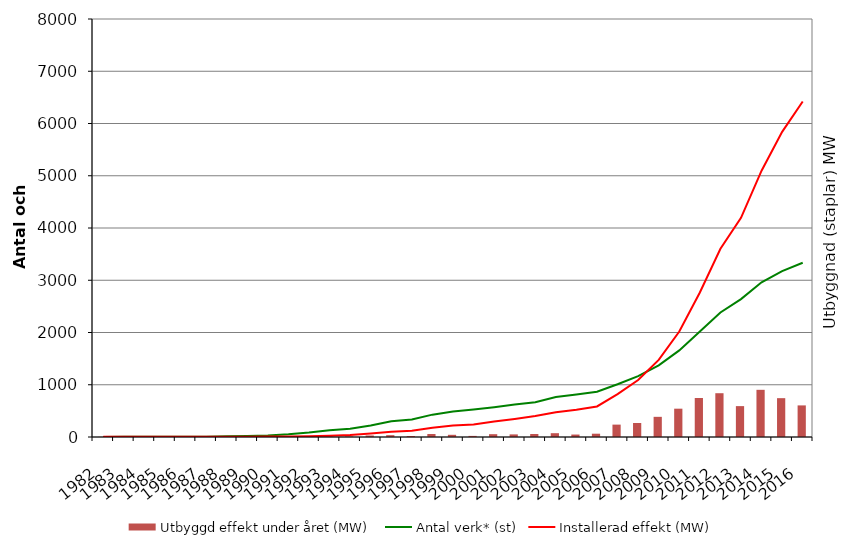
| Category | Utbyggd effekt under året (MW) |
|---|---|
| 1982.0 | 3 |
| 1983.0 | 2 |
| 1984.0 | 0 |
| 1985.0 | 0 |
| 1986.0 | 0 |
| 1987.0 | 0 |
| 1988.0 | 1 |
| 1989.0 | 0 |
| 1990.0 | 2 |
| 1991.0 | 1 |
| 1992.0 | 7 |
| 1993.0 | 10 |
| 1994.0 | 12 |
| 1995.0 | 29 |
| 1996.0 | 35 |
| 1997.0 | 19 |
| 1998.0 | 57 |
| 1999.0 | 42 |
| 2000.0 | 21 |
| 2001.0 | 54 |
| 2002.0 | 50 |
| 2003.0 | 57 |
| 2004.0 | 73 |
| 2005.0 | 47 |
| 2006.0 | 63 |
| 2007.0 | 237 |
| 2008.0 | 268 |
| 2009.0 | 386 |
| 2010.0 | 542 |
| 2011.0 | 747 |
| 2012.0 | 838 |
| 2013.0 | 591 |
| 2014.0 | 903 |
| 2015.0 | 743.293 |
| 2016.0 | 604.728 |